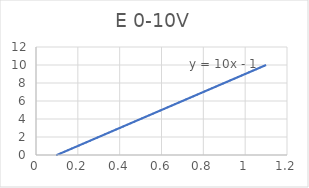
| Category | Series 0 |
|---|---|
| 0.1 | 0 |
| 1.1 | 10 |